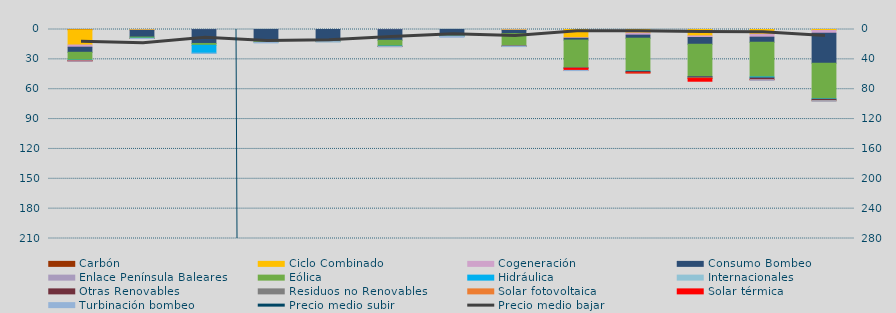
| Category | Carbón | Ciclo Combinado | Cogeneración | Consumo Bombeo | Enlace Península Baleares | Eólica | Hidráulica | Internacionales | Otras Renovables | Residuos no Renovables | Solar fotovoltaica | Solar térmica | Turbinación bombeo |
|---|---|---|---|---|---|---|---|---|---|---|---|---|---|
| 0 | 274.3 | 15310.9 | 2199.5 | 5123.2 |  | 7894.3 | 324.4 | 0 | 365.6 | 0 | 33.3 | 39.3 | 259.1 |
| 1 | 0 | 600 | 290.9 | 6727.7 |  | 1121.1 | 272.6 | 0 | 7.6 | 12.5 | 0.4 | 0 | 84 |
| 2 | 0 | 0 | 66 | 13968.1 |  | 1844.7 | 7917.4 | 0 | 0 | 0 | 0 | 0 | 46.9 |
| 3 | 0 | 0 | 13.8 | 11574.5 |  | 1255.7 | 0 | 313 | 0 | 0 | 0 | 0 | 240.1 |
| 4 | 0 | 0 | 0 | 11798.2 |  | 360.9 | 0 | 0 | 0 | 0 | 0 | 0 | 358.6 |
| 5 | 0 | 0 | 132.9 | 10732.4 |  | 5808.3 | 350.7 | 0 | 98.7 | 0 | 2.1 | 0 | 152.1 |
| 6 | 0 | 0 | 0 | 6311.1 |  | 429.6 | 2 | 0 | 0 | 0 | 0 | 0 | 1049.5 |
| 7 | 0 | 520 | 398.7 | 3208 |  | 12396.3 | 41.7 | 0 | 256.7 | 0 | 0.8 | 0 | 340.4 |
| 8 | 0 | 8320.6 | 532.5 | 1797.8 |  | 27746.3 | 146.7 | 0 | 300.2 | 0 | 250.5 | 1972.6 | 219.1 |
| 9 | 0 | 3526.6 | 2136.1 | 3089.7 |  | 32962.8 | 457 | 0 | 1325.6 | 0 | 38.1 | 15 | 0 |
| 10 | 0 | 6424.4 | 1632 | 6769.5 |  | 32546.8 | 161.3 | 0 | 1318.2 | 30.1 | 404.6 | 2687.6 | 0 |
| 11 | 0 | 4734 | 2991.4 | 5082.6 |  | 34919.2 | 974.6 | 0 | 1593 | 0 | 127.6 | 75.4 | 456.5 |
| 12 | 0 | 1002.5 | 2760.3 | 30103.8 |  | 35894 | 414.2 | 0 | 1401.5 | 0 | 44.9 | 0 | 291.7 |